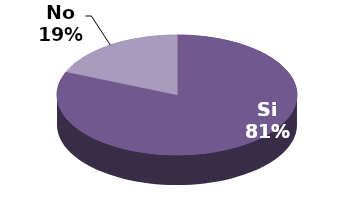
| Category | Series 1 |
|---|---|
| Si | 13 |
| No | 3 |